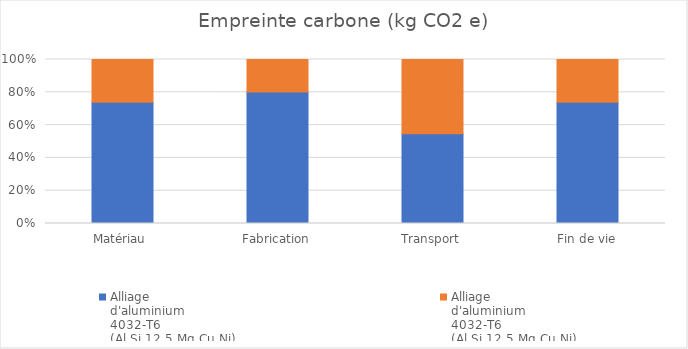
| Category | Alliage
d'aluminium
4032-T6
(Al Si 12,5 Mg Cu Ni)
Biellette initiale | Alliage
d'aluminium
4032-T6
(Al Si 12,5 Mg Cu Ni)
Biellette modifiée |
|---|---|---|
| Matériau | 3.7 | 1.3 |
| Fabrication | 0.137 | 0.034 |
| Transport | 0.011 | 0.009 |
| Fin de vie | 0.091 | 0.032 |